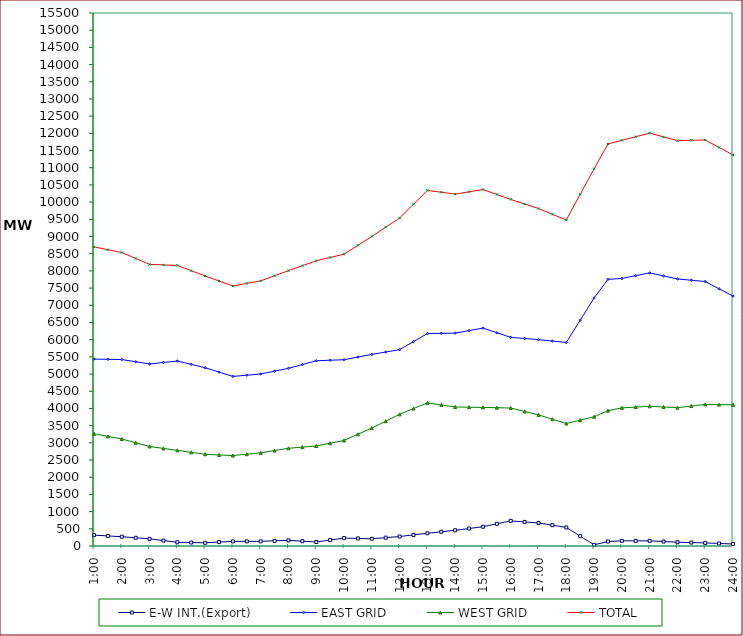
| Category | E-W INT.(Export) | EAST GRID | WEST GRID | TOTAL |
|---|---|---|---|---|
| 1:00 | 316 | 5435 | 3263 | 8698 |
| 1:30 | 293 | 5429 | 3187.5 | 8616.5 |
| 2:00 | 270 | 5423 | 3112 | 8535 |
| 2:30 | 239 | 5358.5 | 3003 | 8361.5 |
| 3:00 | 208 | 5294 | 2894 | 8188 |
| 3:30 | 158 | 5336.5 | 2837.5 | 8174 |
| 4:00 | 108 | 5379 | 2781 | 8160 |
| 4:30 | 101 | 5282 | 2724 | 8006 |
| 5:00 | 94 | 5185 | 2667 | 7852 |
| 5:30 | 114 | 5058 | 2648.5 | 7706.5 |
| 6:00 | 134 | 4931 | 2630 | 7561 |
| 6:30 | 135 | 4966.5 | 2669.5 | 7636 |
| 7:00 | 136 | 5002 | 2709 | 7711 |
| 7:30 | 150 | 5084 | 2775.5 | 7859.5 |
| 8:00 | 164 | 5166 | 2842 | 8008 |
| 8:30 | 140 | 5276.5 | 2875 | 8151.5 |
| 9:00 | 116 | 5387 | 2908 | 8295 |
| 9:30 | 173 | 5402 | 2988.5 | 8390.5 |
| 10:00 | 230 | 5417 | 3069 | 8486 |
| 10:30 | 220 | 5494.5 | 3249.5 | 8744 |
| 11:00 | 210 | 5572 | 3430 | 9002 |
| 11:30 | 243 | 5641 | 3629.5 | 9270.5 |
| 12:00 | 276 | 5710 | 3829 | 9539 |
| 12:30 | 323 | 5944.5 | 3995.5 | 9940 |
| 13:00 | 370 | 6179 | 4162 | 10341 |
| 13:30 | 414 | 6185 | 4102.5 | 10287.5 |
| 14:00 | 458 | 6191 | 4043 | 10234 |
| 14:30 | 509 | 6263.5 | 4037 | 10300.5 |
| 15:00 | 560 | 6336 | 4031 | 10367 |
| 15:30 | 645 | 6201.5 | 4021.5 | 10223 |
| 16:00 | 730 | 6067 | 4012 | 10079 |
| 16:30 | 700 | 6034 | 3912 | 9946 |
| 17:00 | 670 | 6001 | 3812 | 9813 |
| 17:30 | 605 | 5960 | 3687 | 9647 |
| 18:00 | 540 | 5919 | 3562 | 9481 |
| 18:30 | 287 | 6565.5 | 3660.5 | 10226 |
| 19:00 | 34 | 7212 | 3759 | 10971 |
| 19:30 | 130 | 7754 | 3936 | 11690 |
| 20:00 | 150 | 7780 | 4017 | 11797 |
| 20:30 | 150 | 7861.5 | 4040 | 11901.5 |
| 21:00 | 150 | 7943 | 4063 | 12006 |
| 21:30 | 130 | 7854.5 | 4043 | 11897.5 |
| 22:00 | 110 | 7766 | 4023 | 11789 |
| 22:30 | 100 | 7728.5 | 4069.5 | 11798 |
| 23:00 | 90 | 7691 | 4116 | 11807 |
| 23:30 | 74 | 7479 | 4111 | 11590 |
| 24:00 | 58 | 7267 | 4106 | 11373 |